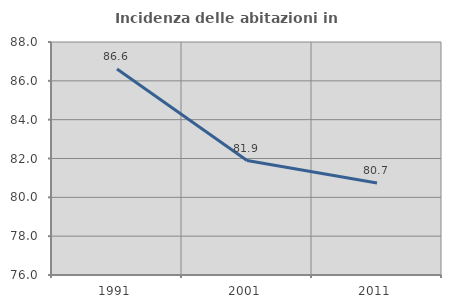
| Category | Incidenza delle abitazioni in proprietà  |
|---|---|
| 1991.0 | 86.614 |
| 2001.0 | 81.897 |
| 2011.0 | 80.734 |